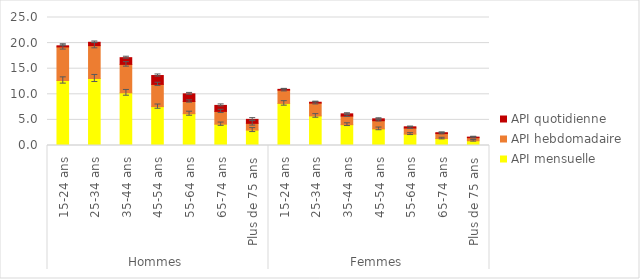
| Category | API mensuelle | API hebdomadaire | API quotidienne |
|---|---|---|---|
| 0 | 12.699 | 6.556 | 0.216 |
| 1 | 13.088 | 6.417 | 0.655 |
| 2 | 10.286 | 5.555 | 1.312 |
| 3 | 7.594 | 4.341 | 1.732 |
| 4 | 6.208 | 2.39 | 1.491 |
| 5 | 4.163 | 2.499 | 1.169 |
| 6 | 3.01 | 1.316 | 0.776 |
| 7 | 8.221 | 2.59 | 0.155 |
| 8 | 5.775 | 2.508 | 0.168 |
| 9 | 4.068 | 1.677 | 0.436 |
| 10 | 3.243 | 1.601 | 0.365 |
| 11 | 2.221 | 1.19 | 0.239 |
| 12 | 1.356 | 0.972 | 0.172 |
| 13 | 0.926 | 0.603 | 0.106 |